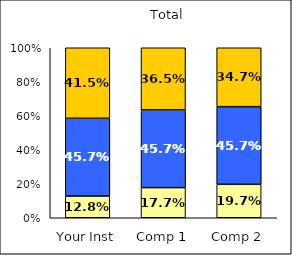
| Category | Low Pluralistic Orientation | Average Pluralistic Orientation | High Pluralistic Orientation |
|---|---|---|---|
| Your Inst | 0.128 | 0.457 | 0.415 |
| Comp 1 | 0.177 | 0.457 | 0.365 |
| Comp 2 | 0.197 | 0.457 | 0.347 |